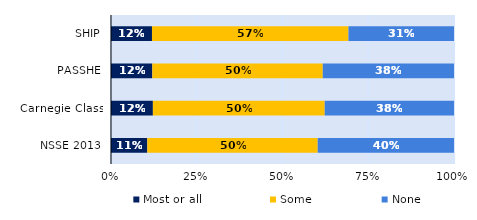
| Category | Most or all | Some | None |
|---|---|---|---|
| SHIP | 0.119 | 0.573 | 0.308 |
| PASSHE | 0.12 | 0.497 | 0.383 |
| Carnegie Class | 0.122 | 0.501 | 0.377 |
| NSSE 2013 | 0.106 | 0.497 | 0.397 |